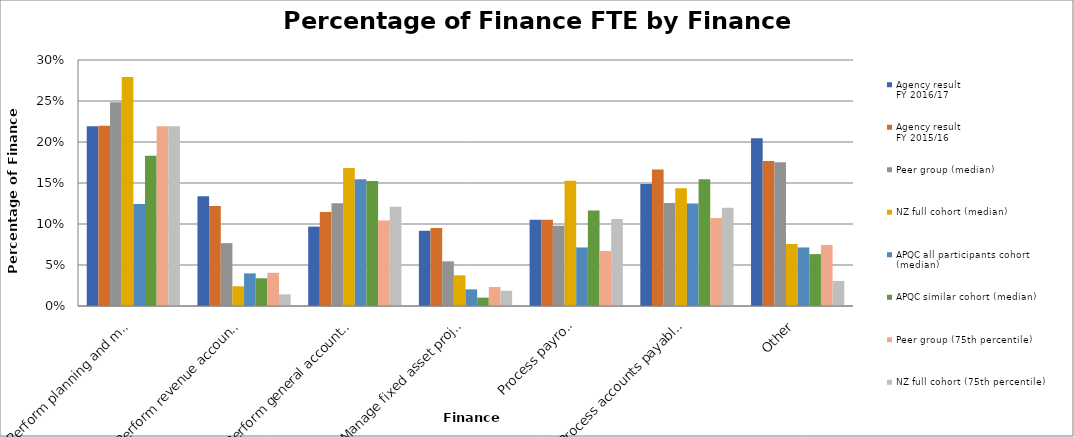
| Category | Agency result
FY 2016/17 | Agency result
FY 2015/16 | Peer group (median) | NZ full cohort (median) | APQC all participants cohort (median) | APQC similar cohort (median) | Peer group (75th percentile) | NZ full cohort (75th percentile) |
|---|---|---|---|---|---|---|---|---|
| Perform planning and management accounting | 0.219 | 0.22 | 0.249 | 0.279 | 0.124 | 0.183 | 0.219 | 0.219 |
| Perform revenue accounting | 0.134 | 0.122 | 0.077 | 0.024 | 0.04 | 0.034 | 0.04 | 0.014 |
| Perform general accounting and reporting | 0.097 | 0.115 | 0.125 | 0.168 | 0.154 | 0.152 | 0.104 | 0.121 |
| Manage fixed asset project accounting | 0.092 | 0.095 | 0.054 | 0.037 | 0.02 | 0.01 | 0.023 | 0.019 |
| Process payroll | 0.105 | 0.105 | 0.098 | 0.153 | 0.071 | 0.117 | 0.067 | 0.106 |
| Process accounts payable and expense reimbursements | 0.149 | 0.166 | 0.126 | 0.144 | 0.125 | 0.154 | 0.107 | 0.12 |
| Other | 0.205 | 0.177 | 0.175 | 0.076 | 0.071 | 0.063 | 0.074 | 0.031 |